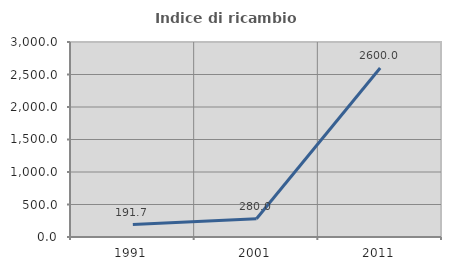
| Category | Indice di ricambio occupazionale  |
|---|---|
| 1991.0 | 191.667 |
| 2001.0 | 280 |
| 2011.0 | 2600 |